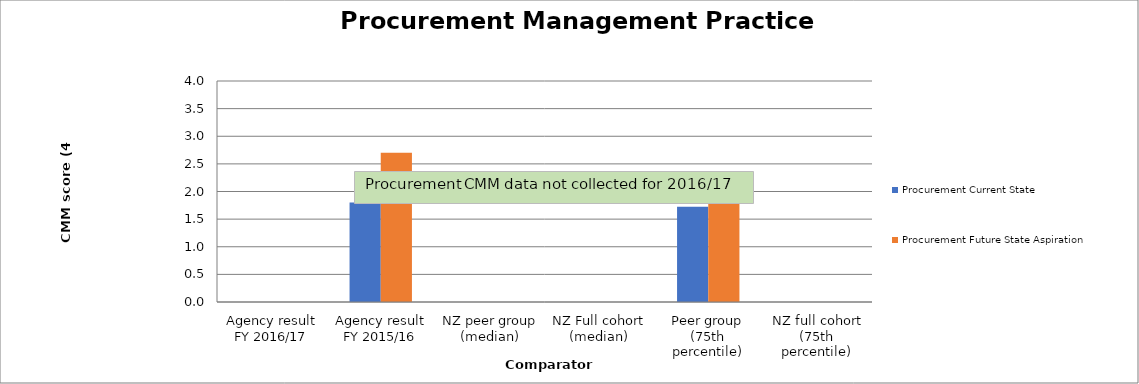
| Category | Procurement Current State | Procurement Future State Aspiration |
|---|---|---|
| Agency result
FY 2016/17 | 0 | 0 |
| Agency result
FY 2015/16 | 1.8 | 2.7 |
| NZ peer group (median) | 0 | 0 |
| NZ Full cohort (median) | 0 | 0 |
| Peer group (75th percentile) | 1.725 | 2.025 |
| NZ full cohort (75th percentile) | 0 | 0 |